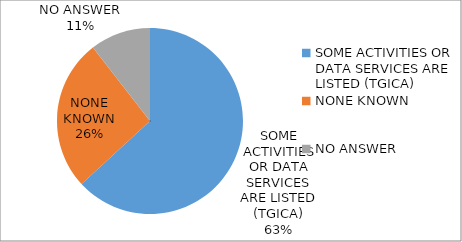
| Category | Series 0 |
|---|---|
| SOME ACTIVITIES OR DATA SERVICES ARE LISTED (TGICA) | 0.632 |
| NONE KNOWN | 0.263 |
| NO ANSWER | 0.105 |